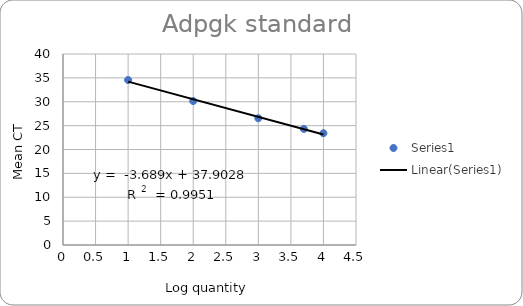
| Category | Series 0 |
|---|---|
| 1.0 | 34.554 |
| 2.0 | 30.148 |
| 3.0 | 26.551 |
| 3.6989700043360187 | 24.316 |
| 4.0 | 23.409 |